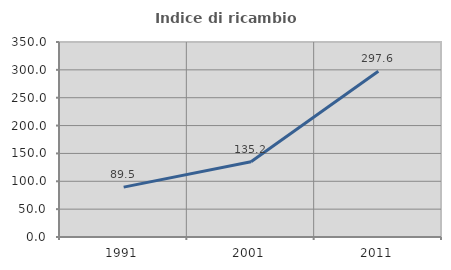
| Category | Indice di ricambio occupazionale  |
|---|---|
| 1991.0 | 89.547 |
| 2001.0 | 135.176 |
| 2011.0 | 297.631 |